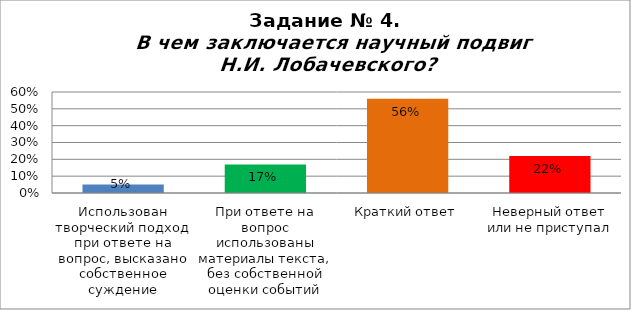
| Category | В чем заключается научный подвиг Н.И. Лобачевского? |
|---|---|
| Использован творческий подход при ответе на вопрос, высказано собственное суждение | 0.05 |
| При ответе на вопрос использованы материалы текста, без собственной оценки событий | 0.17 |
| Краткий ответ | 0.56 |
| Неверный ответ или не приступал | 0.22 |